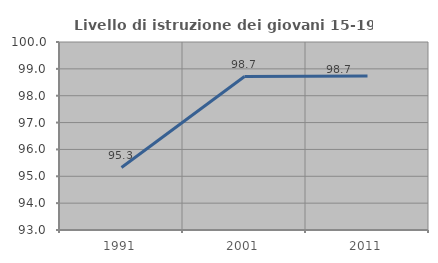
| Category | Livello di istruzione dei giovani 15-19 anni |
|---|---|
| 1991.0 | 95.327 |
| 2001.0 | 98.715 |
| 2011.0 | 98.73 |